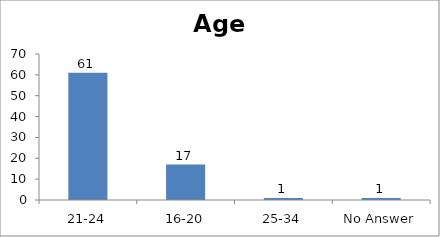
| Category | Age |
|---|---|
| 21-24 | 61 |
| 16-20 | 17 |
| 25-34 | 1 |
| No Answer | 1 |